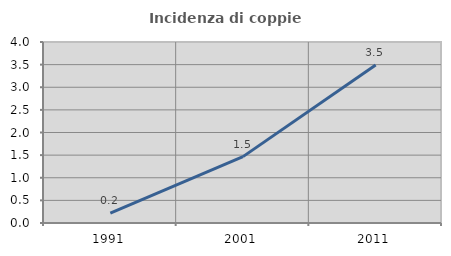
| Category | Incidenza di coppie miste |
|---|---|
| 1991.0 | 0.22 |
| 2001.0 | 1.467 |
| 2011.0 | 3.493 |